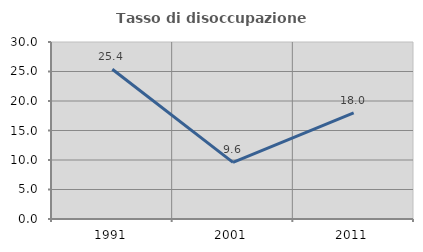
| Category | Tasso di disoccupazione giovanile  |
|---|---|
| 1991.0 | 25.373 |
| 2001.0 | 9.6 |
| 2011.0 | 18 |